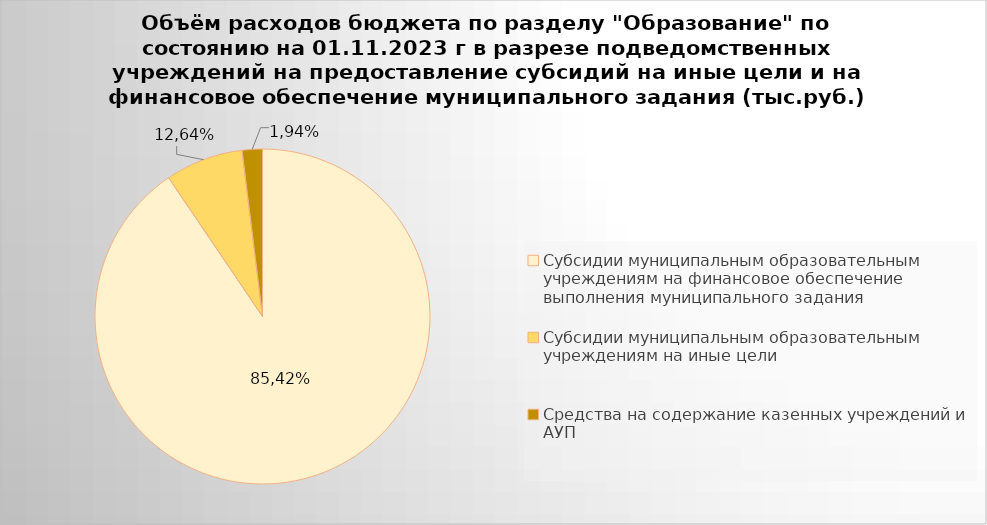
| Category | Series 0 |
|---|---|
| Субсидии муниципальным образовательным учреждениям на финансовое обеспечение выполнения муниципального задания | 7917987.83 |
| Субсидии муниципальным образовательным учреждениям на иные цели | 656736.36 |
| Средства на содержание казенных учреждений и АУП | 171499.11 |